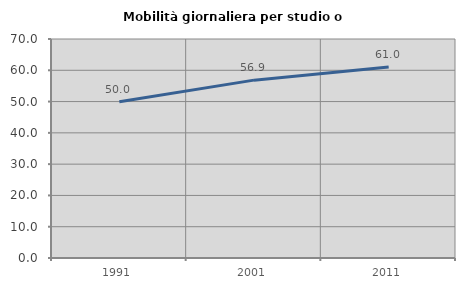
| Category | Mobilità giornaliera per studio o lavoro |
|---|---|
| 1991.0 | 49.956 |
| 2001.0 | 56.851 |
| 2011.0 | 61.025 |